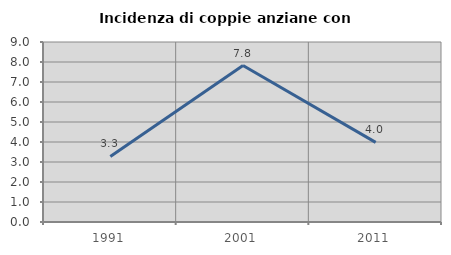
| Category | Incidenza di coppie anziane con figli |
|---|---|
| 1991.0 | 3.279 |
| 2001.0 | 7.821 |
| 2011.0 | 3.98 |